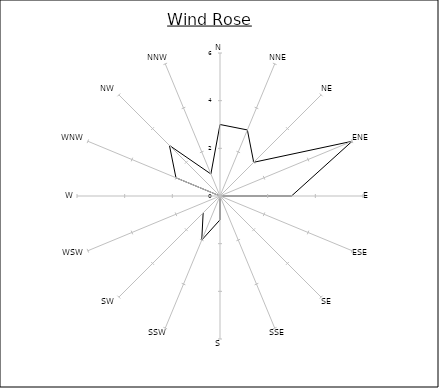
| Category | Series 0 |
|---|---|
| N | 3 |
| NNE | 3 |
| NE | 2 |
| ENE | 6 |
| E | 3 |
| ESE | 0 |
| SE | 1 |
| SSE | 0 |
| S | 1 |
| SSW | 2 |
| SW | 1 |
| WSW | 0 |
| W | 0 |
| WNW | 2 |
| NW | 3 |
| NNW | 1 |